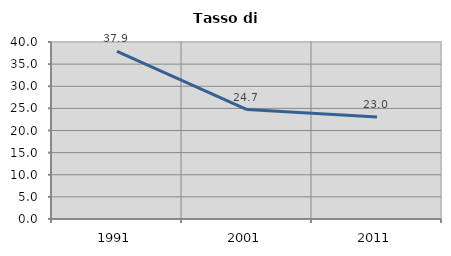
| Category | Tasso di disoccupazione   |
|---|---|
| 1991.0 | 37.902 |
| 2001.0 | 24.737 |
| 2011.0 | 23.043 |